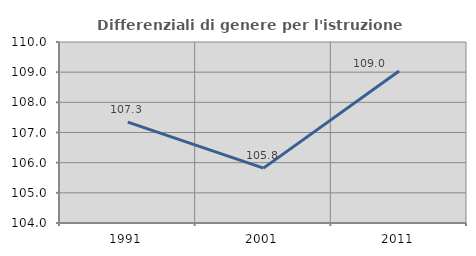
| Category | Differenziali di genere per l'istruzione superiore |
|---|---|
| 1991.0 | 107.341 |
| 2001.0 | 105.82 |
| 2011.0 | 109.039 |